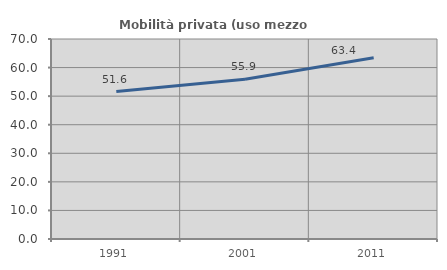
| Category | Mobilità privata (uso mezzo privato) |
|---|---|
| 1991.0 | 51.608 |
| 2001.0 | 55.942 |
| 2011.0 | 63.411 |